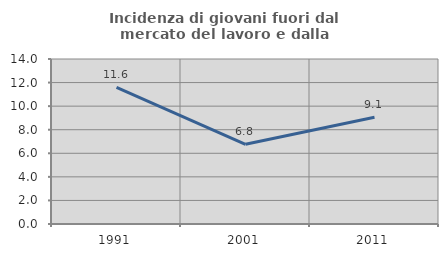
| Category | Incidenza di giovani fuori dal mercato del lavoro e dalla formazione  |
|---|---|
| 1991.0 | 11.594 |
| 2001.0 | 6.764 |
| 2011.0 | 9.051 |